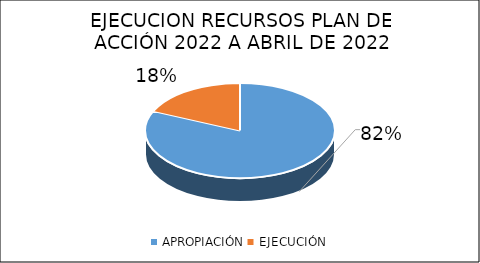
| Category | Series 0 |
|---|---|
| APROPIACIÓN | 24811303554.56 |
| EJECUCIÓN | 5530083336.75 |